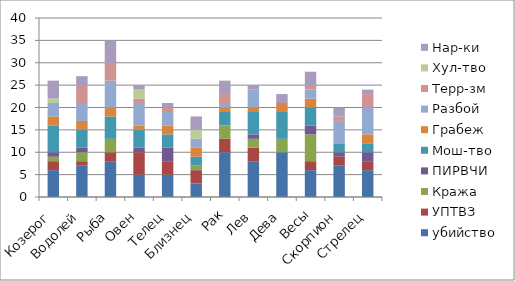
| Category | убийство | УПТВЗ | Кража | ПИРВЧИ | Мош-тво | Грабеж | Разбой | Терр-зм | Хул-тво | Нар-ки |
|---|---|---|---|---|---|---|---|---|---|---|
| Козерог | 6 | 2 | 1 | 1 | 6 | 2 | 3 | 0 | 1 | 4 |
| Водолей | 7 | 1 | 2 | 1 | 4 | 2 | 4 | 4 | 0 | 2 |
| Рыба | 8 | 2 | 3 | 0 | 5 | 2 | 6 | 4 | 0 | 5 |
| Овен | 5 | 5 | 0 | 1 | 4 | 1 | 5 | 1 | 2 | 1 |
| Телец | 5 | 3 | 0 | 3 | 3 | 2 | 3 | 1 | 0 | 1 |
| Близнец | 3 | 3 | 1 | 0 | 2 | 2 | 2 | 0 | 2 | 3 |
| Рак | 10 | 3 | 3 | 0 | 3 | 1 | 1 | 2 | 0 | 3 |
| Лев | 8 | 3 | 2 | 1 | 5 | 1 | 4 | 0 | 0 | 1 |
| Дева | 10 | 0 | 3 | 0 | 6 | 2 | 0 | 0 | 0 | 2 |
| Весы | 6 | 2 | 6 | 2 | 4 | 2 | 2 | 1 | 0 | 3 |
| Скорпион | 7 | 2 | 0 | 1 | 2 | 0 | 5 | 1 | 0 | 2 |
| Стрелец | 6 | 2 | 0 | 2 | 2 | 2 | 6 | 3 | 0 | 1 |